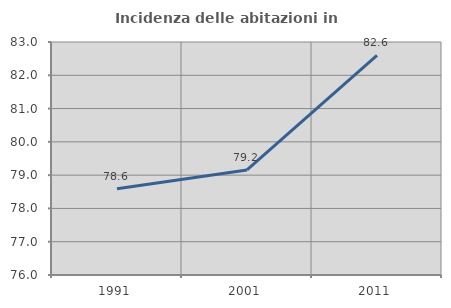
| Category | Incidenza delle abitazioni in proprietà  |
|---|---|
| 1991.0 | 78.59 |
| 2001.0 | 79.156 |
| 2011.0 | 82.598 |